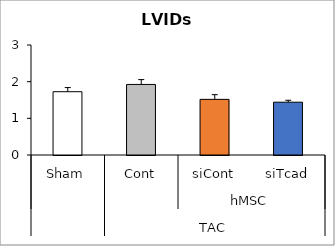
| Category | Series 0 |
|---|---|
| 0 | 1.726 |
| 1 | 1.924 |
| 2 | 1.517 |
| 3 | 1.44 |